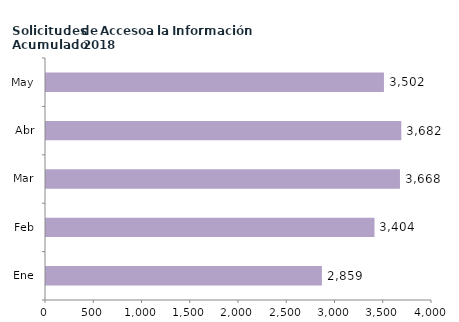
| Category | Series 0 |
|---|---|
| Ene | 2859 |
| Feb | 3404 |
| Mar | 3668 |
| Abr | 3682 |
| May | 3502 |